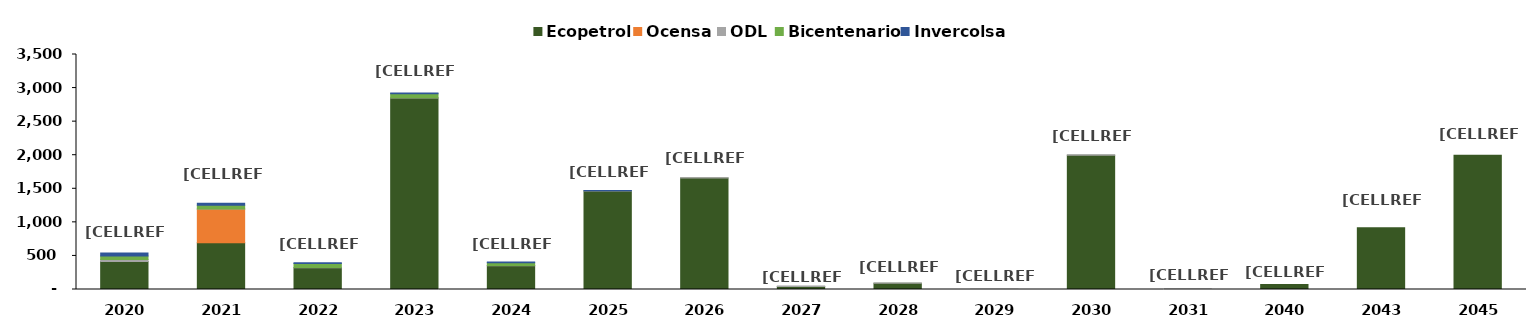
| Category | Ecopetrol | Ocensa | ODL | Bicentenario | Invercolsa |
|---|---|---|---|---|---|
| 2020.0 | 418.278 | 0 | 28.378 | 53.074 | 43.789 |
| 2021.0 | 697.516 | 500 | 3.038 | 55.309 | 29.806 |
| 2022.0 | 324.533 | 0 | 3.25 | 57.683 | 13.781 |
| 2023.0 | 2850.828 | 0 | 3.478 | 60.476 | 13.006 |
| 2024.0 | 353.823 | 0 | 3.722 | 39.48 | 12.542 |
| 2025.0 | 1467.229 | 0 | 3.983 | 0 | 3.995 |
| 2026.0 | 1660.47 | 0 | 4.262 | 0 | 0 |
| 2027.0 | 45.849 | 0 | 4.561 | 0 | 0 |
| 2028.0 | 92.447 | 0 | 4.881 | 0 | 0 |
| 2029.0 | 0 | 0 | 5.223 | 0 | 0 |
| 2030.0 | 2000 | 0 | 5.589 | 0 | 0 |
| 2031.0 | 0 | 0 | 5.981 | 0 | 0 |
| 2040.0 | 75.634 | 0 | 0 | 0 | 0 |
| 2043.0 | 919.954 | 0 | 0 | 0 | 0 |
| 2045.0 | 2000 | 0 | 0 | 0 | 0 |